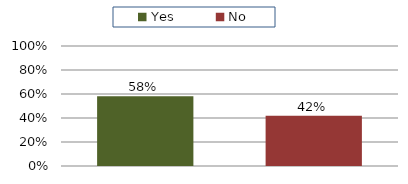
| Category | Total |
|---|---|
| Yes | 0.582 |
| No | 0.418 |